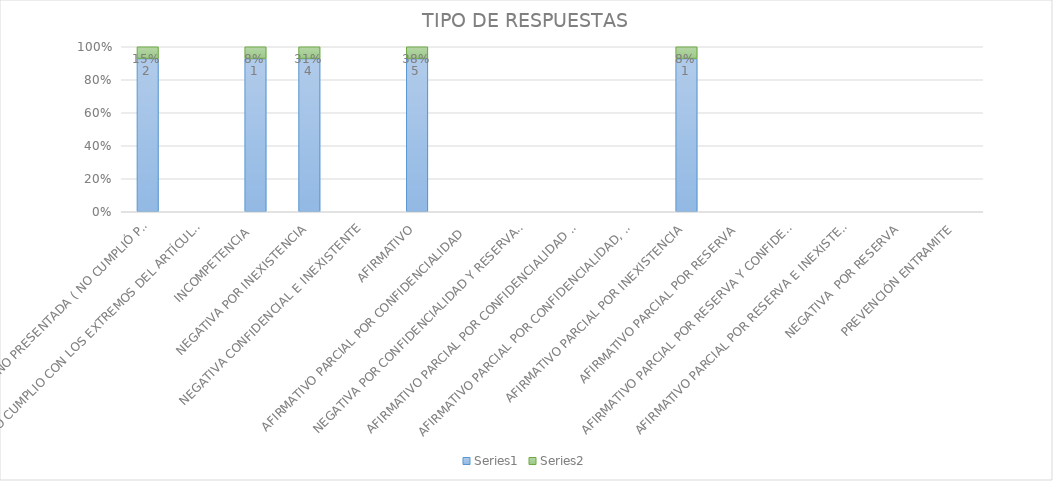
| Category | Series 4 | Series 5 |
|---|---|---|
| SE TIENE POR NO PRESENTADA ( NO CUMPLIÓ PREVENCIÓN) | 2 | 0.154 |
| NO CUMPLIO CON LOS EXTREMOS DEL ARTÍCULO 79 (REQUISITOS) | 0 | 0 |
| INCOMPETENCIA  | 1 | 0.077 |
| NEGATIVA POR INEXISTENCIA | 4 | 0.308 |
| NEGATIVA CONFIDENCIAL E INEXISTENTE | 0 | 0 |
| AFIRMATIVO | 5 | 0.385 |
| AFIRMATIVO PARCIAL POR CONFIDENCIALIDAD  | 0 | 0 |
| NEGATIVA POR CONFIDENCIALIDAD Y RESERVADA | 0 | 0 |
| AFIRMATIVO PARCIAL POR CONFIDENCIALIDAD E INEXISTENCIA | 0 | 0 |
| AFIRMATIVO PARCIAL POR CONFIDENCIALIDAD, RESERVA E INEXISTENCIA | 0 | 0 |
| AFIRMATIVO PARCIAL POR INEXISTENCIA | 1 | 0.077 |
| AFIRMATIVO PARCIAL POR RESERVA | 0 | 0 |
| AFIRMATIVO PARCIAL POR RESERVA Y CONFIDENCIALIDAD | 0 | 0 |
| AFIRMATIVO PARCIAL POR RESERVA E INEXISTENCIA | 0 | 0 |
| NEGATIVA  POR RESERVA | 0 | 0 |
| PREVENCIÓN ENTRAMITE | 0 | 0 |